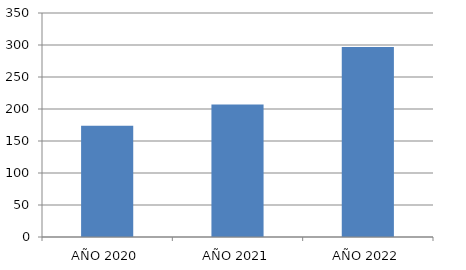
| Category | Series 0 |
|---|---|
| AÑO 2020 | 174 |
| AÑO 2021 | 207 |
| AÑO 2022 | 297 |